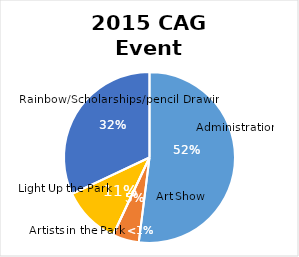
| Category | Series 0 |
|---|---|
| 0 | 0.52 |
| 1 | 0.05 |
| 2 | 0 |
| 3 | 0.11 |
| 4 | 0.32 |